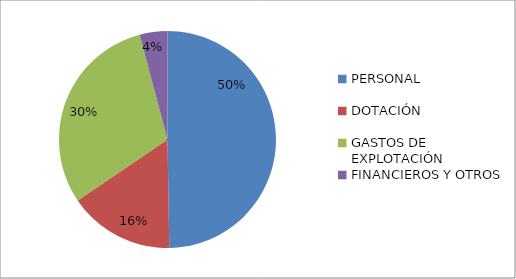
| Category | 2015 |
|---|---|
| PERSONAL | 2047593.11 |
| DOTACIÓN | 649662.32 |
| GASTOS DE EXPLOTACIÓN | 1249498.01 |
| FINANCIEROS Y OTROS | 170196.63 |